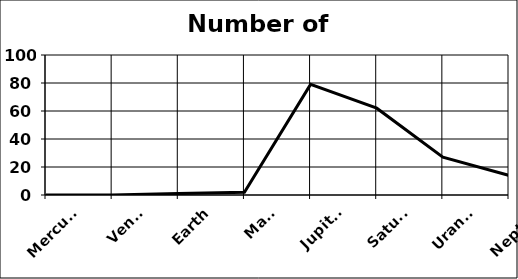
| Category | Number of Moons |
|---|---|
| Mercury | 0 |
| Venus | 0 |
| Earth | 1 |
| Mars | 2 |
| Jupiter | 79 |
| Saturn | 62 |
| Uranus | 27 |
| Neptune | 14 |